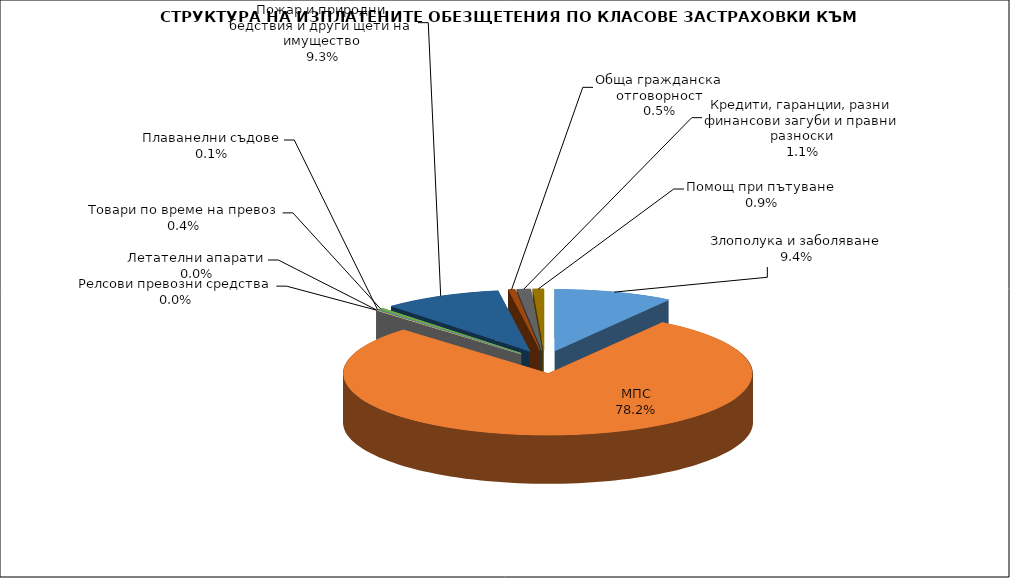
| Category | Злополука и заболяване |
|---|---|
| Злополука и заболяване | 0.094 |
| МПС | 0.782 |
| Релсови превозни средства | 0 |
| Летателни апарати | 0 |
| Плаванелни съдове | 0.001 |
| Товари по време на превоз | 0.004 |
| Пожар и природни бедствия и други щети на имущество | 0.093 |
| Обща гражданска отговорност | 0.005 |
| Кредити, гаранции, разни финансови загуби и правни разноски | 0.011 |
| Помощ при пътуване | 0.009 |